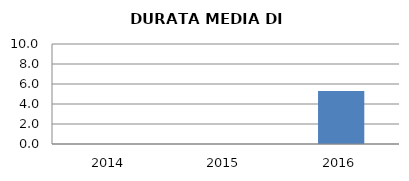
| Category | 2014 2015 2016 |
|---|---|
| 2014.0 | 0 |
| 2015.0 | 0 |
| 2016.0 | 5.308 |